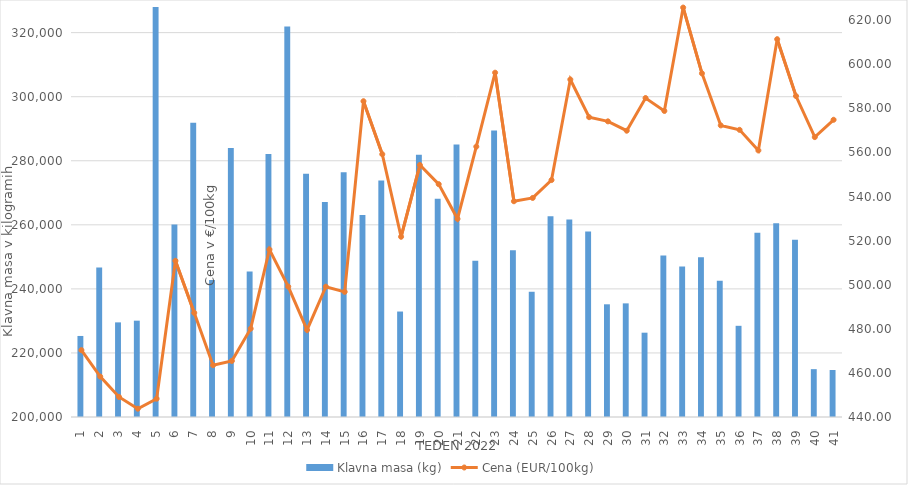
| Category | Klavna masa (kg) |
|---|---|
| 1.0 | 225300 |
| 2.0 | 246712 |
| 3.0 | 229541 |
| 4.0 | 230074 |
| 5.0 | 328640 |
| 6.0 | 260108 |
| 7.0 | 291887 |
| 8.0 | 242732 |
| 9.0 | 283987 |
| 10.0 | 245414 |
| 11.0 | 282092 |
| 12.0 | 321936 |
| 13.0 | 275950 |
| 14.0 | 267148 |
| 15.0 | 276417 |
| 16.0 | 263098 |
| 17.0 | 273824 |
| 18.0 | 232926 |
| 19.0 | 281859 |
| 20.0 | 268153 |
| 21.0 | 285073 |
| 22.0 | 248783 |
| 23.0 | 289478 |
| 24.0 | 252069 |
| 25.0 | 239099 |
| 26.0 | 262689 |
| 27.0 | 261656 |
| 28.0 | 257905 |
| 29.0 | 235185 |
| 30.0 | 235475 |
| 31.0 | 226322 |
| 32.0 | 250418 |
| 33.0 | 246996 |
| 34.0 | 249873 |
| 35.0 | 242516 |
| 36.0 | 228469 |
| 37.0 | 257511 |
| 38.0 | 260481 |
| 39.0 | 255370 |
| 40.0 | 214936 |
| 41.0 | 214672 |